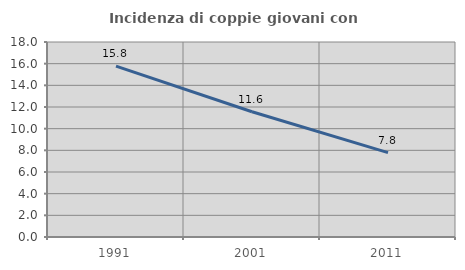
| Category | Incidenza di coppie giovani con figli |
|---|---|
| 1991.0 | 15.778 |
| 2001.0 | 11.561 |
| 2011.0 | 7.789 |